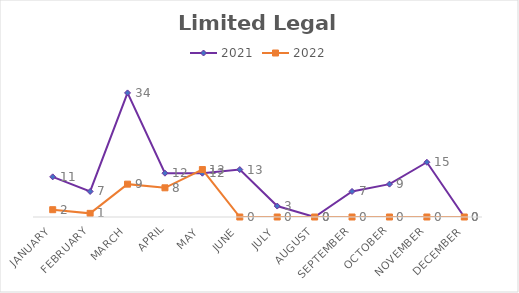
| Category | 2021 | 2022 |
|---|---|---|
| January | 11 | 2 |
| February | 7 | 1 |
| March | 34 | 9 |
| April | 12 | 8 |
| May | 12 | 13 |
| June | 13 | 0 |
| July | 3 | 0 |
| August | 0 | 0 |
| September | 7 | 0 |
| October | 9 | 0 |
| November | 15 | 0 |
| December | 0 | 0 |